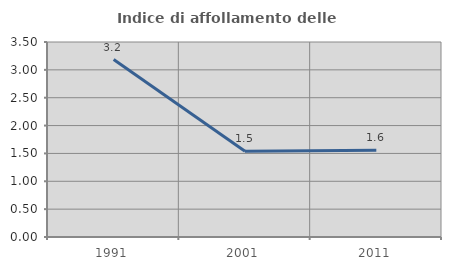
| Category | Indice di affollamento delle abitazioni  |
|---|---|
| 1991.0 | 3.185 |
| 2001.0 | 1.539 |
| 2011.0 | 1.558 |